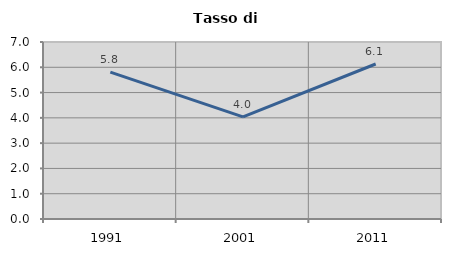
| Category | Tasso di disoccupazione   |
|---|---|
| 1991.0 | 5.807 |
| 2001.0 | 4.036 |
| 2011.0 | 6.131 |